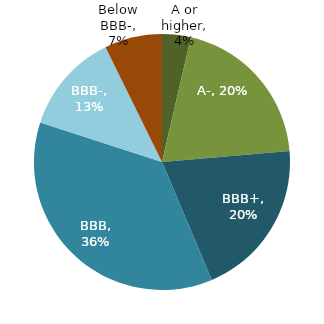
| Category | Series 0 |
|---|---|
| A or higher | 0.036 |
| A- | 0.2 |
| BBB+ | 0.2 |
| BBB | 0.364 |
| BBB- | 0.127 |
| Below BBB- | 0.073 |